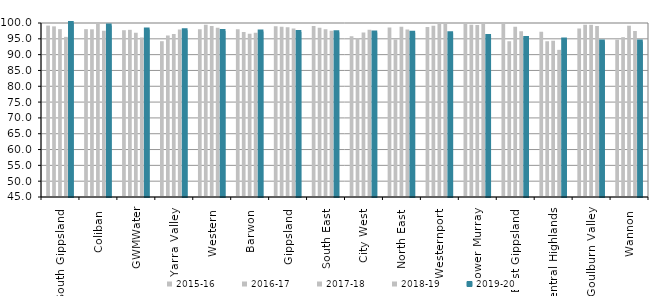
| Category | 2015-16 | 2016-17 | 2017-18 | 2018-19 | 2019-20 |
|---|---|---|---|---|---|
| South Gippsland  | 99.174 | 98.936 | 98.058 | 95.614 | 100 |
| Coliban  | 98.052 | 98.007 | 100 | 97.552 | 99.237 |
| GWMWater | 97.718 | 97.845 | 96.907 | 95.431 | 97.947 |
| Yarra Valley  | 94.25 | 96.07 | 96.546 | 97.918 | 97.69 |
| Western  | 98 | 99.474 | 99.048 | 98.5 | 97.475 |
| Barwon  | 98 | 97.143 | 96.584 | 96.887 | 97.321 |
| Gippsland  | 98.969 | 98.777 | 98.619 | 98.297 | 97.161 |
| South East  | 99.065 | 98.531 | 98.015 | 97.547 | 97.039 |
| City West  | 95.828 | 95.228 | 97.011 | 97.873 | 97.024 |
| North East  | 98.551 | 94.762 | 98.81 | 97.949 | 96.916 |
| Westernport  | 98.718 | 99.123 | 100 | 100 | 96.774 |
| Lower Murray  | 100 | 99.419 | 99.367 | 100 | 95.918 |
| East Gippsland  | 100 | 94.203 | 98.851 | 97.403 | 95.238 |
| Central Highlands  | 97.244 | 94.196 | 94.35 | 91.513 | 94.776 |
| Goulburn Valley  | 98.268 | 99.429 | 99.422 | 99.057 | 94.18 |
| Wannon  | 94.737 | 95.522 | 99.138 | 97.479 | 94.118 |